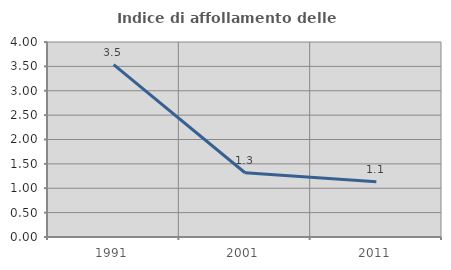
| Category | Indice di affollamento delle abitazioni  |
|---|---|
| 1991.0 | 3.535 |
| 2001.0 | 1.318 |
| 2011.0 | 1.135 |